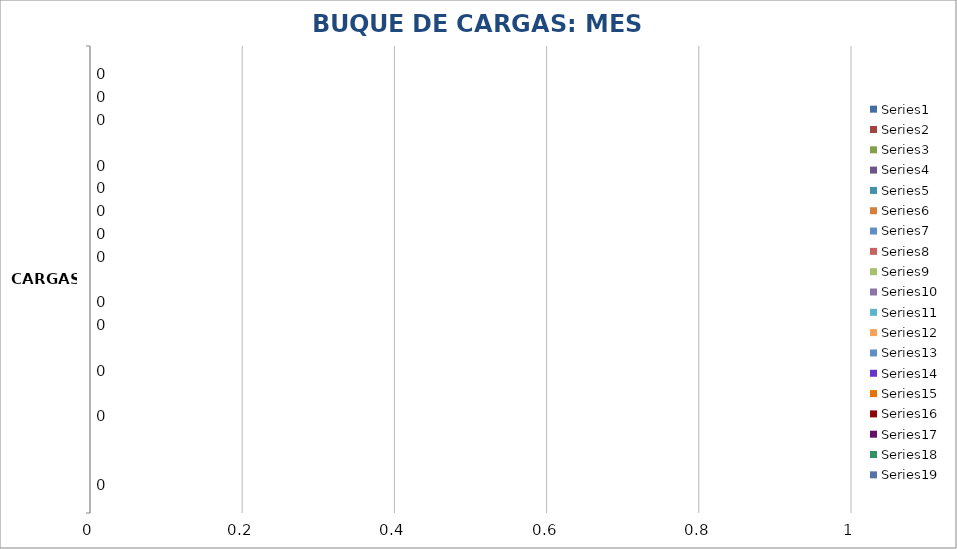
| Category | Series 0 | Series 1 | Series 2 | Series 3 | Series 4 | Series 5 | Series 6 | Series 7 | Series 8 | Series 9 | Series 10 | Series 11 | Series 12 | Series 13 | Series 14 | Series 15 | Series 16 | Series 17 | Series 18 |
|---|---|---|---|---|---|---|---|---|---|---|---|---|---|---|---|---|---|---|---|
| CARGAS | 0 | 0 | 0 | 0 | 0 | 0 | 0 | 0 | 0 | 0 | 0 | 0 | 0 | 0 | 0 | 0 | 0 | 0 | 0 |